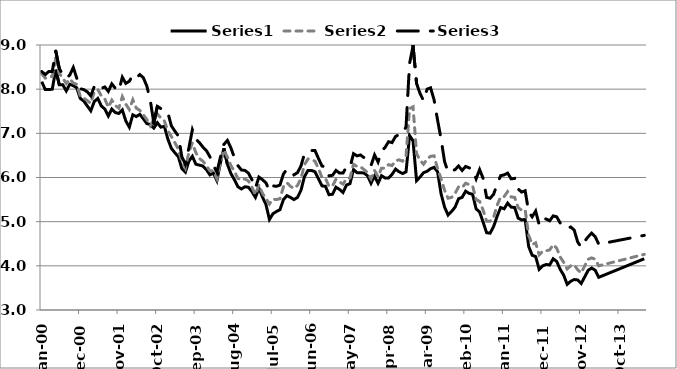
| Category | Series 0 | Series 1 | Series 2 |
|---|---|---|---|
| 2000-01-01 | 8.17 | 8.35 | 8.4 |
| 2000-02-01 | 7.99 | 8.25 | 8.33 |
| 2000-03-01 | 7.99 | 8.28 | 8.4 |
| 2000-04-01 | 8 | 8.29 | 8.4 |
| 2000-05-01 | 8.44 | 8.7 | 8.86 |
| 2000-06-01 | 8.1 | 8.36 | 8.47 |
| 2000-07-01 | 8.1 | 8.25 | 8.33 |
| 2000-08-01 | 7.96 | 8.13 | 8.25 |
| 2000-09-01 | 8.11 | 8.23 | 8.32 |
| 2000-10-01 | 8.08 | 8.14 | 8.49 |
| 2000-11-01 | 8.03 | 8.11 | 8.25 |
| 2000-12-01 | 7.79 | 7.84 | 8.01 |
| 2001-01-01 | 7.73 | 7.8 | 7.99 |
| 2001-02-01 | 7.62 | 7.74 | 7.94 |
| 2001-03-01 | 7.51 | 7.68 | 7.85 |
| 2001-04-01 | 7.72 | 7.94 | 8.06 |
| 2001-05-01 | 7.79 | 7.99 | 8.11 |
| 2001-06-01 | 7.62 | 7.85 | 8.02 |
| 2001-07-01 | 7.55 | 7.78 | 8.05 |
| 2001-08-01 | 7.39 | 7.59 | 7.95 |
| 2001-09-01 | 7.55 | 7.75 | 8.12 |
| 2001-10-01 | 7.47 | 7.63 | 8.02 |
| 2001-11-01 | 7.45 | 7.57 | 7.96 |
| 2001-12-01 | 7.53 | 7.83 | 8.27 |
| 2002-01-01 | 7.28 | 7.66 | 8.13 |
| 2002-02-01 | 7.14 | 7.54 | 8.18 |
| 2002-03-01 | 7.42 | 7.76 | 8.32 |
| 2002-04-01 | 7.38 | 7.57 | 8.26 |
| 2002-05-01 | 7.43 | 7.52 | 8.33 |
| 2002-06-01 | 7.33 | 7.42 | 8.26 |
| 2002-07-01 | 7.22 | 7.31 | 8.07 |
| 2002-08-01 | 7.2 | 7.17 | 7.74 |
| 2002-09-01 | 7.12 | 7.32 | 7.23 |
| 2002-10-01 | 7.24 | 7.44 | 7.61 |
| 2002-11-01 | 7.14 | 7.35 | 7.56 |
| 2002-12-01 | 7.16 | 7.28 | 7.52 |
| 2003-01-01 | 6.87 | 7.06 | 7.47 |
| 2003-02-01 | 6.66 | 6.93 | 7.17 |
| 2003-03-01 | 6.56 | 6.79 | 7.05 |
| 2003-04-01 | 6.47 | 6.64 | 6.94 |
| 2003-05-01 | 6.2 | 6.36 | 6.47 |
| 2003-06-01 | 6.12 | 6.21 | 6.3 |
| 2003-07-01 | 6.37 | 6.57 | 6.67 |
| 2003-08-01 | 6.48 | 6.78 | 7.08 |
| 2003-09-01 | 6.3 | 6.56 | 6.87 |
| 2003-10-01 | 6.28 | 6.43 | 6.79 |
| 2003-11-01 | 6.26 | 6.37 | 6.69 |
| 2003-12-01 | 6.18 | 6.27 | 6.61 |
| 2004-01-01 | 6.06 | 6.15 | 6.47 |
| 2004-02-01 | 6.1 | 6.15 | 6.28 |
| 2004-03-01 | 5.93 | 5.97 | 6.12 |
| 2004-04-01 | 6.33 | 6.35 | 6.46 |
| 2004-05-01 | 6.66 | 6.62 | 6.75 |
| 2004-06-01 | 6.3 | 6.46 | 6.84 |
| 2004-07-01 | 6.09 | 6.27 | 6.67 |
| 2004-08-01 | 5.95 | 6.14 | 6.45 |
| 2004-09-01 | 5.79 | 5.98 | 6.27 |
| 2004-10-01 | 5.74 | 5.94 | 6.17 |
| 2004-11-01 | 5.79 | 5.97 | 6.16 |
| 2004-12-01 | 5.78 | 5.92 | 6.1 |
| 2005-01-01 | 5.68 | 5.78 | 5.95 |
| 2005-02-01 | 5.55 | 5.61 | 5.76 |
| 2005-03-01 | 5.76 | 5.83 | 6.01 |
| 2005-04-01 | 5.56 | 5.64 | 5.95 |
| 2005-05-01 | 5.39 | 5.53 | 5.88 |
| 2005-06-01 | 5.05 | 5.4 | 5.7 |
| 2005-07-01 | 5.18 | 5.51 | 5.81 |
| 2005-08-01 | 5.23 | 5.5 | 5.8 |
| 2005-09-01 | 5.27 | 5.52 | 5.83 |
| 2005-10-01 | 5.5 | 5.79 | 6.08 |
| 2005-11-01 | 5.59 | 5.88 | 6.19 |
| 2005-12-01 | 5.55 | 5.8 | 6.14 |
| 2006-01-01 | 5.5 | 5.75 | 6.06 |
| 2006-02-01 | 5.55 | 5.82 | 6.11 |
| 2006-03-01 | 5.71 | 5.98 | 6.26 |
| 2006-04-01 | 6.02 | 6.29 | 6.54 |
| 2006-05-01 | 6.16 | 6.42 | 6.59 |
| 2006-06-01 | 6.16 | 6.4 | 6.61 |
| 2006-07-01 | 6.13 | 6.37 | 6.61 |
| 2006-08-01 | 5.97 | 6.2 | 6.43 |
| 2006-09-01 | 5.81 | 6 | 6.26 |
| 2006-10-01 | 5.8 | 5.98 | 6.24 |
| 2006-11-01 | 5.61 | 5.8 | 6.04 |
| 2006-12-01 | 5.62 | 5.81 | 6.05 |
| 2007-01-01 | 5.78 | 5.96 | 6.16 |
| 2007-02-01 | 5.73 | 5.9 | 6.1 |
| 2007-03-01 | 5.66 | 5.85 | 6.1 |
| 2007-04-01 | 5.83 | 5.97 | 6.24 |
| 2007-05-01 | 5.86 | 5.99 | 6.23 |
| 2007-06-01 | 6.18 | 6.3 | 6.54 |
| 2007-07-01 | 6.11 | 6.25 | 6.49 |
| 2007-08-01 | 6.11 | 6.24 | 6.51 |
| 2007-09-01 | 6.1 | 6.18 | 6.45 |
| 2007-10-01 | 6.04 | 6.11 | 6.36 |
| 2007-11-01 | 5.87 | 5.97 | 6.27 |
| 2007-12-01 | 6.03 | 6.16 | 6.51 |
| 2008-01-01 | 5.87 | 6.02 | 6.35 |
| 2008-02-01 | 6.04 | 6.21 | 6.6 |
| 2008-03-01 | 5.99 | 6.21 | 6.68 |
| 2008-04-01 | 5.99 | 6.29 | 6.81 |
| 2008-05-01 | 6.07 | 6.27 | 6.79 |
| 2008-06-01 | 6.19 | 6.38 | 6.93 |
| 2008-07-01 | 6.13 | 6.4 | 6.97 |
| 2008-08-01 | 6.09 | 6.37 | 6.98 |
| 2008-09-01 | 6.13 | 6.49 | 7.15 |
| 2008-10-01 | 6.95 | 7.56 | 8.58 |
| 2008-11-01 | 6.83 | 7.6 | 8.98 |
| 2008-12-01 | 5.93 | 6.54 | 8.13 |
| 2009-01-01 | 6.01 | 6.39 | 7.9 |
| 2009-02-01 | 6.11 | 6.3 | 7.74 |
| 2009-03-01 | 6.14 | 6.42 | 8 |
| 2009-04-01 | 6.2 | 6.48 | 8.03 |
| 2009-05-01 | 6.23 | 6.49 | 7.76 |
| 2009-06-01 | 6.13 | 6.2 | 7.3 |
| 2009-07-01 | 5.63 | 5.97 | 6.87 |
| 2009-08-01 | 5.33 | 5.71 | 6.36 |
| 2009-09-01 | 5.15 | 5.53 | 6.12 |
| 2009-10-01 | 5.23 | 5.55 | 6.14 |
| 2009-11-01 | 5.33 | 5.64 | 6.18 |
| 2009-12-01 | 5.52 | 5.79 | 6.26 |
| 2010-01-01 | 5.55 | 5.77 | 6.16 |
| 2010-02-01 | 5.69 | 5.87 | 6.25 |
| 2010-03-01 | 5.64 | 5.84 | 6.22 |
| 2010-04-01 | 5.62 | 5.81 | 6.19 |
| 2010-05-01 | 5.29 | 5.5 | 5.97 |
| 2010-06-01 | 5.22 | 5.46 | 6.18 |
| 2010-07-01 | 4.99 | 5.26 | 5.98 |
| 2010-08-01 | 4.75 | 5.01 | 5.55 |
| 2010-09-01 | 4.74 | 5.01 | 5.53 |
| 2010-10-01 | 4.89 | 5.1 | 5.62 |
| 2010-11-01 | 5.12 | 5.37 | 5.85 |
| 2010-12-01 | 5.32 | 5.56 | 6.04 |
| 2011-01-01 | 5.29 | 5.57 | 6.06 |
| 2011-02-01 | 5.42 | 5.68 | 6.1 |
| 2011-03-01 | 5.33 | 5.56 | 5.97 |
| 2011-04-01 | 5.32 | 5.55 | 5.98 |
| 2011-05-01 | 5.08 | 5.32 | 5.74 |
| 2011-06-01 | 5.04 | 5.26 | 5.67 |
| 2011-07-01 | 5.05 | 5.27 | 5.7 |
| 2011-08-01 | 4.44 | 4.69 | 5.22 |
| 2011-09-01 | 4.24 | 4.48 | 5.11 |
| 2011-10-01 | 4.21 | 4.52 | 5.24 |
| 2011-11-01 | 3.92 | 4.25 | 4.93 |
| 2011-12-01 | 4 | 4.33 | 5.07 |
| 2012-01-01 | 4.03 | 4.34 | 5.06 |
| 2012-02-01 | 4.02 | 4.36 | 5.02 |
| 2012-03-01 | 4.16 | 4.48 | 5.13 |
| 2012-04-01 | 4.1 | 4.4 | 5.11 |
| 2012-05-01 | 3.92 | 4.2 | 4.97 |
| 2012-06-01 | 3.79 | 4.08 | 4.91 |
| 2012-07-01 | 3.58 | 3.93 | 4.85 |
| 2012-08-01 | 3.65 | 4 | 4.88 |
| 2012-09-01 | 3.69 | 4.02 | 4.81 |
| 2012-10-01 | 3.68 | 3.91 | 4.54 |
| 2012-11-01 | 3.6 | 3.84 | 4.42 |
| 2012-12-01 | 3.75 | 4 | 4.56 |
| 2013-01-01 | 3.9 | 4.15 | 4.66 |
| 2013-02-01 | 3.95 | 4.18 | 4.74 |
| 2013-03-01 | 3.9 | 4.15 | 4.66 |
| 2013-04-01 | 3.74 | 4 | 4.49 |
| 2014-05-01 | 4.16 | 4.26 | 4.69 |